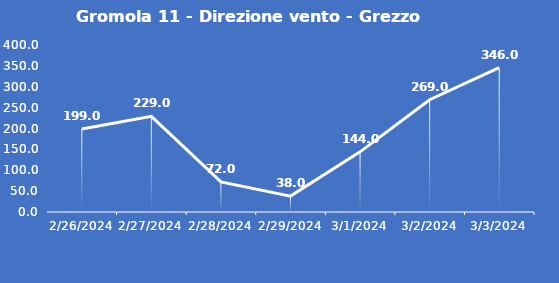
| Category | Gromola 11 - Direzione vento - Grezzo (°N) |
|---|---|
| 2/26/24 | 199 |
| 2/27/24 | 229 |
| 2/28/24 | 72 |
| 2/29/24 | 38 |
| 3/1/24 | 144 |
| 3/2/24 | 269 |
| 3/3/24 | 346 |